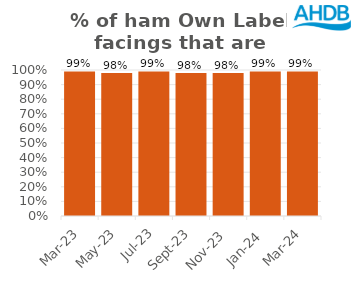
| Category | Ham |
|---|---|
| 2023-03-01 | 0.99 |
| 2023-05-01 | 0.98 |
| 2023-07-01 | 0.99 |
| 2023-09-01 | 0.98 |
| 2023-11-01 | 0.98 |
| 2024-01-01 | 0.99 |
| 2024-03-01 | 0.99 |